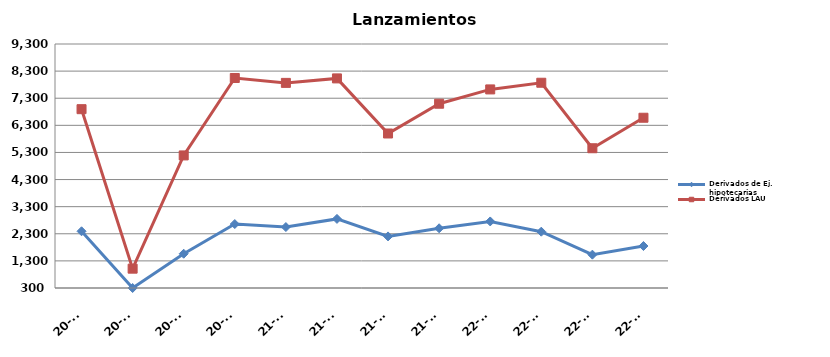
| Category | Derivados de Ej. hipotecarias | Derivados LAU |
|---|---|---|
| 20-T1 | 2392 | 6896 |
| 20-T2 | 300 | 1013 |
| 20-T3 | 1564 | 5190 |
| 20-T4 | 2659 | 8046 |
| 21-T1 | 2548 | 7866 |
| 21-T2 | 2849 | 8031 |
| 21-T3 | 2203 | 5999 |
| 21-T4 | 2503 | 7097 |
| 22-T1 | 2755 | 7625 |
| 22-T2 | 2377 | 7871 |
| 22-T3 | 1530 | 5455 |
| 22-T4 | 1849 | 6580 |